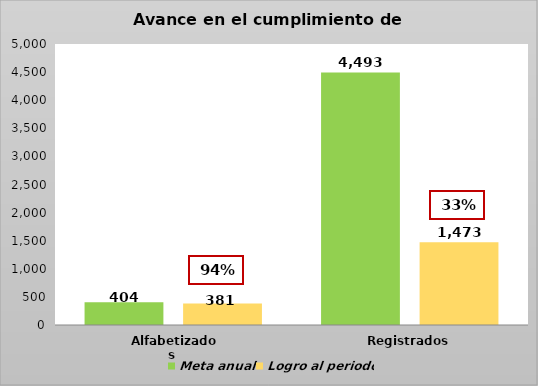
| Category | Meta anual | Logro al periodo |
|---|---|---|
| Alfabetizados  | 404 | 381 |
| Registrados | 4493 | 1473 |